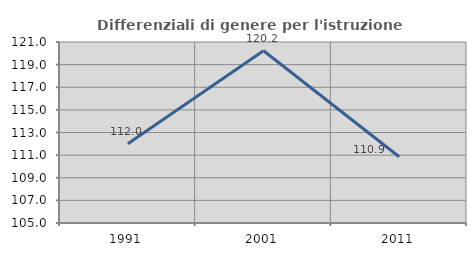
| Category | Differenziali di genere per l'istruzione superiore |
|---|---|
| 1991.0 | 112.001 |
| 2001.0 | 120.224 |
| 2011.0 | 110.852 |